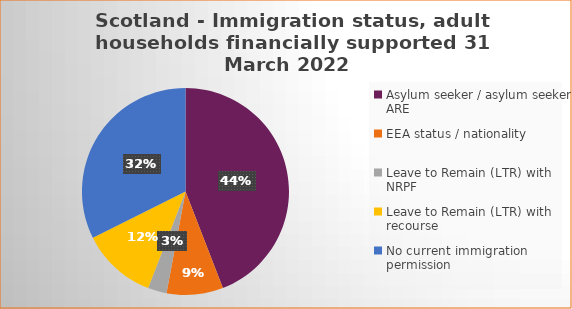
| Category | Number  | Percentage |
|---|---|---|
| Asylum seeker / asylum seeker ARE | 15 | 0.441 |
| EEA status / nationality  | 3 | 0.088 |
| Leave to Remain (LTR) with NRPF | 1 | 0.029 |
| Leave to Remain (LTR) with recourse | 4 | 0.118 |
| No current immigration permission | 11 | 0.324 |